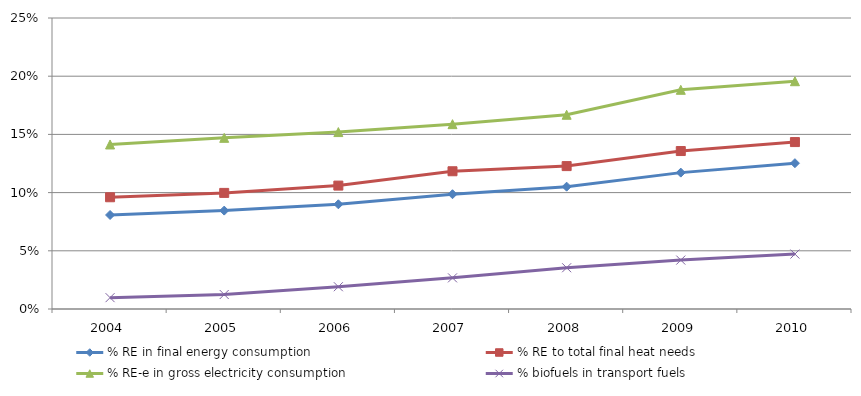
| Category | % RE in final energy consumption | % RE to total final heat needs | % RE-e in gross electricity consumption | % biofuels in transport fuels |
|---|---|---|---|---|
| 2004.0 | 0.081 | 0.096 | 0.141 | 0.01 |
| 2005.0 | 0.085 | 0.1 | 0.147 | 0.012 |
| 2006.0 | 0.09 | 0.106 | 0.152 | 0.019 |
| 2007.0 | 0.099 | 0.118 | 0.159 | 0.027 |
| 2008.0 | 0.105 | 0.123 | 0.167 | 0.035 |
| 2009.0 | 0.117 | 0.136 | 0.188 | 0.042 |
| 2010.0 | 0.125 | 0.143 | 0.196 | 0.047 |